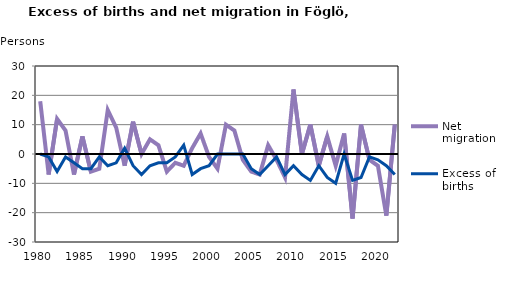
| Category | Net migration | Excess of births |
|---|---|---|
| 1980.0 | 18 | 0 |
| 1981.0 | -7 | -1 |
| 1982.0 | 12 | -6 |
| 1983.0 | 8 | -1 |
| 1984.0 | -7 | -3 |
| 1985.0 | 6 | -5 |
| 1986.0 | -6 | -5 |
| 1987.0 | -5 | -1 |
| 1988.0 | 15 | -4 |
| 1989.0 | 9 | -3 |
| 1990.0 | -4 | 2 |
| 1991.0 | 11 | -4 |
| 1992.0 | 0 | -7 |
| 1993.0 | 5 | -4 |
| 1994.0 | 3 | -3 |
| 1995.0 | -6 | -3 |
| 1996.0 | -3 | -1 |
| 1997.0 | -4 | 3 |
| 1998.0 | 2 | -7 |
| 1999.0 | 7 | -5 |
| 2000.0 | -1 | -4 |
| 2001.0 | -5 | 0 |
| 2002.0 | 10 | 0 |
| 2003.0 | 8 | 0 |
| 2004.0 | -2 | 0 |
| 2005.0 | -6 | -5 |
| 2006.0 | -7 | -7 |
| 2007.0 | 3 | -4 |
| 2008.0 | -2 | -1 |
| 2009.0 | -8 | -7 |
| 2010.0 | 22 | -4 |
| 2011.0 | 0 | -7 |
| 2012.0 | 10 | -9 |
| 2013.0 | -4 | -4 |
| 2014.0 | 6 | -8 |
| 2015.0 | -4 | -10 |
| 2016.0 | 7 | 0 |
| 2017.0 | -22 | -9 |
| 2018.0 | 10 | -8 |
| 2019.0 | -2 | -1 |
| 2020.0 | -4 | -2 |
| 2021.0 | -21 | -4 |
| 2022.0 | 10 | -7 |